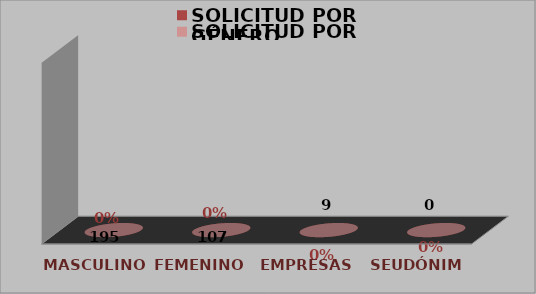
| Category | SOLICITUD POR GÉNERO |
|---|---|
| MASCULINO | 0 |
| FEMENINO | 0 |
| EMPRESAS | 0 |
| SEUDÓNIMO | 0 |